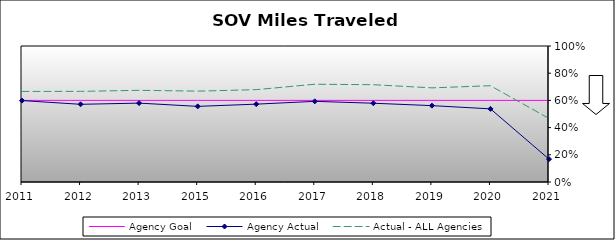
| Category | Agency Goal | Agency Actual | Actual - ALL Agencies |
|---|---|---|---|
| 2011.0 | 0.6 | 0.599 | 0.666 |
| 2012.0 | 0.6 | 0.571 | 0.666 |
| 2013.0 | 0.6 | 0.58 | 0.674 |
| 2015.0 | 0.6 | 0.556 | 0.668 |
| 2016.0 | 0.6 | 0.572 | 0.679 |
| 2017.0 | 0.6 | 0.593 | 0.719 |
| 2018.0 | 0.6 | 0.579 | 0.715 |
| 2019.0 | 0.6 | 0.562 | 0.692 |
| 2020.0 | 0.6 | 0.538 | 0.708 |
| 2021.0 | 0.6 | 0.168 | 0.467 |